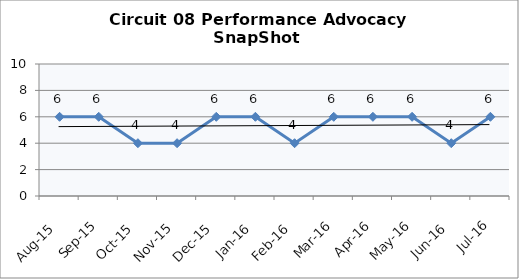
| Category | Circuit 08 |
|---|---|
| Aug-15 | 6 |
| Sep-15 | 6 |
| Oct-15 | 4 |
| Nov-15 | 4 |
| Dec-15 | 6 |
| Jan-16 | 6 |
| Feb-16 | 4 |
| Mar-16 | 6 |
| Apr-16 | 6 |
| May-16 | 6 |
| Jun-16 | 4 |
| Jul-16 | 6 |